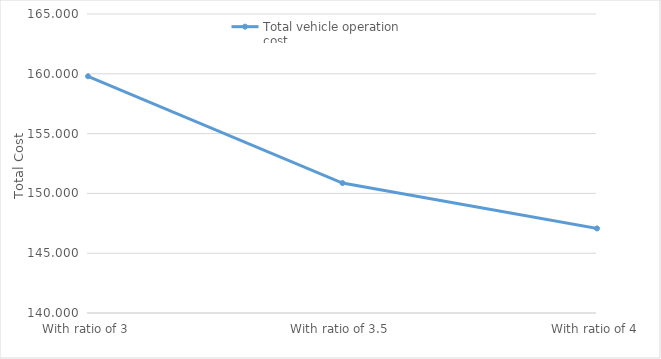
| Category | Total vehicle operation cost |
|---|---|
| With ratio of 3 | 159.794 |
| With ratio of 3.5 | 150.865 |
| With ratio of 4 | 147.069 |